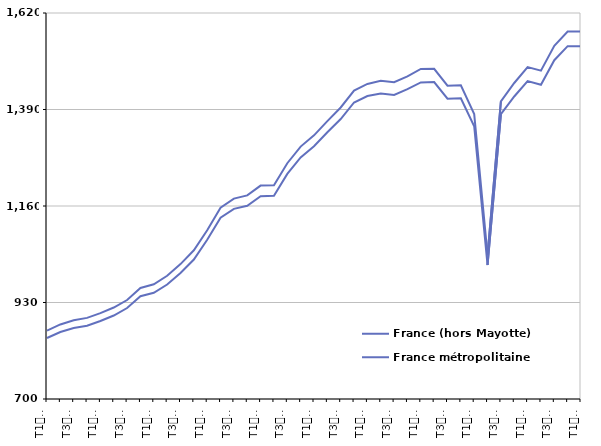
| Category | France (hors Mayotte) | France métropolitaine |
|---|---|---|
| T1
2012 | 862.8 | 845.4 |
| T2
2012 | 877.7 | 859.7 |
| T3
2012 | 887.6 | 869.1 |
| T4
2012 | 893.3 | 874.5 |
| T1
2013 | 904.7 | 885.8 |
| T2
2013 | 918 | 898.9 |
| T3
2013 | 935.9 | 916.8 |
| T4
2013 | 964.6 | 945 |
| T1
2014 | 973.4 | 953.1 |
| T2
2014 | 993.6 | 972.9 |
| T3
2014 | 1021.5 | 1000.3 |
| T4
2014 | 1054.4 | 1032.4 |
| T1
2015 | 1102.1 | 1079.7 |
| T2
2015 | 1155.9 | 1132.3 |
| T3
2015 | 1177.6 | 1153.3 |
| T4
2015 | 1185.3 | 1160.4 |
| T1
2016 | 1208.6 | 1183.5 |
| T2
2016 | 1209.2 | 1184.3 |
| T3
2016 | 1262 | 1236.4 |
| T4
2016 | 1301.6 | 1275.9 |
| T1
2017 | 1328.3 | 1302.4 |
| T2
2017 | 1362.4 | 1335.7 |
| T3
2017 | 1394.8 | 1367.2 |
| T4
2017 | 1435.1 | 1406.7 |
| T1
2018 | 1450.9 | 1422.1 |
| T2
2018 | 1458.3 | 1428.3 |
| T3
2018 | 1455.2 | 1424.7 |
| T4
2018 | 1469.1 | 1438.5 |
| T1
2019 | 1486.6 | 1454.6 |
| T2
2019 | 1486.9 | 1455.5 |
| T3
2019 | 1446.8 | 1415.9 |
| T4
2019 | 1447.7 | 1416.9 |
| T1
2020 | 1379 | 1350.1 |
| T2
2020 | 1043 | 1019.3 |
| T3
2020 | 1409.1 | 1378.7 |
| T4
2020 | 1453.2 | 1421 |
| T1
2021 | 1491.2 | 1457.7 |
| T2
2021 | 1482.6 | 1448.8 |
| T3
2021 | 1541.8 | 1507.5 |
| T4
2021 | 1575.7 | 1541 |
| T1
2022 | 1575.8 | 1540.8 |